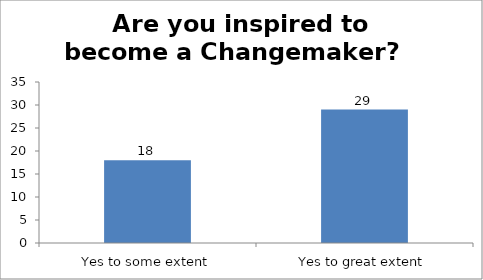
| Category | Are you inspired to become a Changemaker?   |
|---|---|
| Yes to some extent | 18 |
| Yes to great extent | 29 |